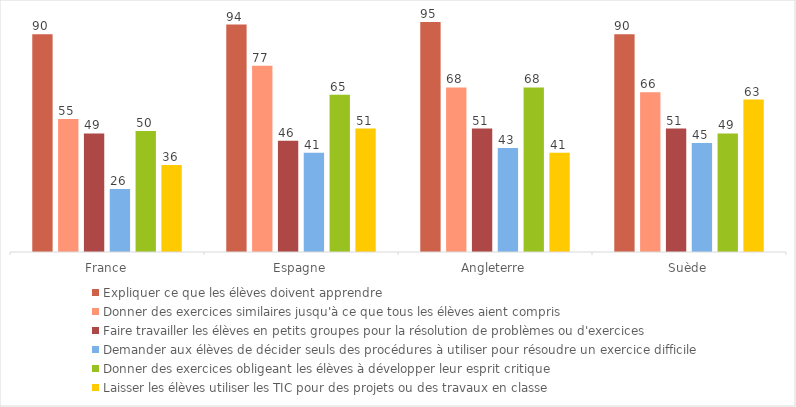
| Category | Expliquer ce que les élèves doivent apprendre | Donner des exercices similaires jusqu'à ce que tous les élèves aient compris | Faire travailler les élèves en petits groupes pour la résolution de problèmes ou d'exercices | Demander aux élèves de décider seuls des procédures à utiliser pour résoudre un exercice difficile | Donner des exercices obligeant les élèves à développer leur esprit critique | Laisser les élèves utiliser les TIC pour des projets ou des travaux en classe |
|---|---|---|---|---|---|---|
| France | 90 | 55 | 49 | 26 | 50 | 36 |
| Espagne | 94 | 77 | 46 | 41 | 65 | 51 |
| Angleterre | 95 | 68 | 51 | 43 | 68 | 41 |
| Suède | 90 | 66 | 51 | 45 | 49 | 63 |